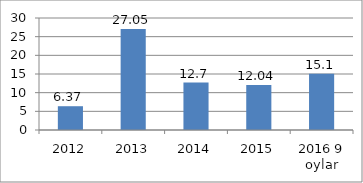
| Category | Series 0 |
|---|---|
| 2012 | 6.37 |
| 2013 | 27.05 |
| 2014 | 12.7 |
| 2015 | 12.04 |
| 2016 9 oylar | 15.1 |